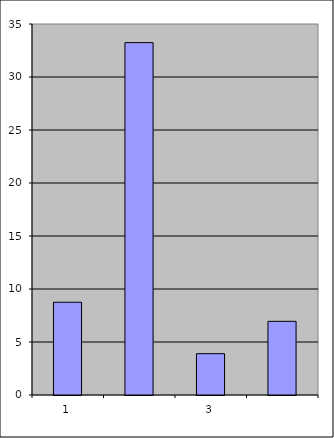
| Category | Series 0 |
|---|---|
| 0 | 8.75 |
| 1 | 33.242 |
| 2 | 3.9 |
| 3 | 6.95 |